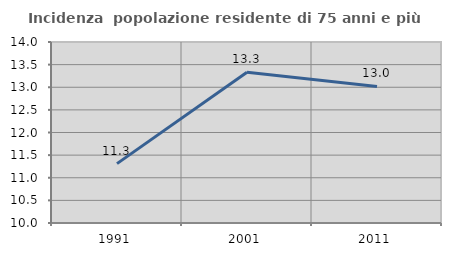
| Category | Incidenza  popolazione residente di 75 anni e più |
|---|---|
| 1991.0 | 11.312 |
| 2001.0 | 13.333 |
| 2011.0 | 13.018 |